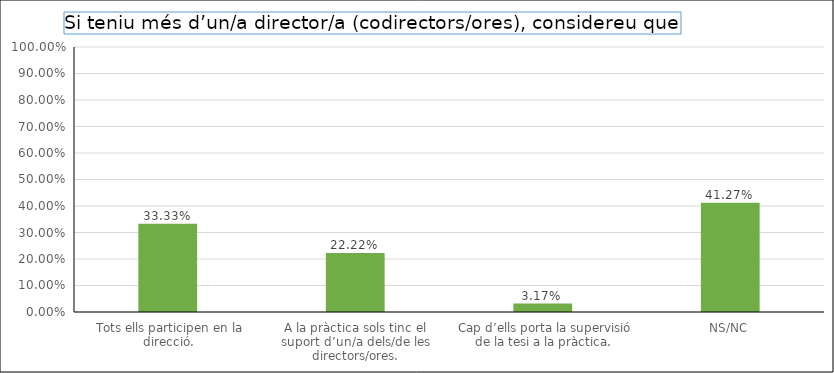
| Category | Series 0 |
|---|---|
|  Tots ells participen en la direcció. | 0.333 |
| A la pràctica sols tinc el suport d’un/a dels/de les directors/ores. | 0.222 |
|  Cap d’ells porta la supervisió de la tesi a la pràctica. | 0.032 |
| NS/NC | 0.413 |